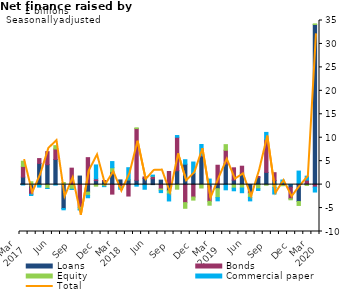
| Category | Loans | Bonds | Equity | Commercial paper |
|---|---|---|---|---|
| Mar 
2017 | 1.605 | 2.272 | 1.113 |  |
|  | -0.731 | -1.325 | 0.612 |  |
|  | 4.512 | 1.039 | -0.147 |  |
| Jun | 4.255 | 2.776 | -0.81 |  |
|  | 5.369 | 2.237 | 0.705 |  |
|  | -5.096 | 0.002 | 0.444 |  |
| Sep | -0.126 | 3.51 | -0.862 |  |
|  | 1.822 | -4.847 | -0.37 |  |
|  | -1.595 | 5.749 | -0.708 |  |
| Dec | 0.862 | 0.379 | -0.327 |  |
|  | 0.785 | 0.093 | -0.321 |  |
|  | 2.708 | -2.027 | 0.895 |  |
| Mar 
2018 | 0.999 | -0.433 | -0.204 |  |
|  | 1.012 | -2.435 | 0.06 |  |
|  | 0.922 | 11.031 | 0.153 |  |
| Jun | 1.347 | 0.294 | -0.014 |  |
|  | 1.259 | 0.494 | 0.042 |  |
|  | 0.957 | -0.932 | -0.342 |  |
| Sep | -1.313 | 2.795 | -0.692 |  |
|  | 2.965 | 7.138 | -0.974 |  |
|  | 4.352 | -3.846 | -1.203 |  |
| Dec | 2.408 | -2.65 | -0.654 |  |
|  | 6.077 | 0.161 | -0.724 |  |
|  | -0.484 | -3.084 | -0.823 |  |
| Mar 
2019 | -0.869 | 4.131 | -1.908 |  |
|  | 4.414 | 2.92 | 1.19 |  |
|  | 0.961 | 2.622 | -0.754 |  |
| Jun | 2.487 | 1.437 | -0.727 |  |
|  | -1.598 | -0.281 | -0.845 |  |
|  | 1.555 | 0.174 | -0.892 |  |
| Sep | 2.605 | 6.981 | -0.127 |  |
|  | 0.89 | 1.651 | -0.592 |  |
|  | 0.317 | -0.195 | -0.04 |  |
| Dec | -0.595 | -2.415 | -0.23 |  |
|  | -3.602 | 0.155 | -0.844 |  |
|  | 0.21 | 0.764 | -0.167 |  |
| Mar 
2020 | 34.147 | -0.54 | 0.126 |  |